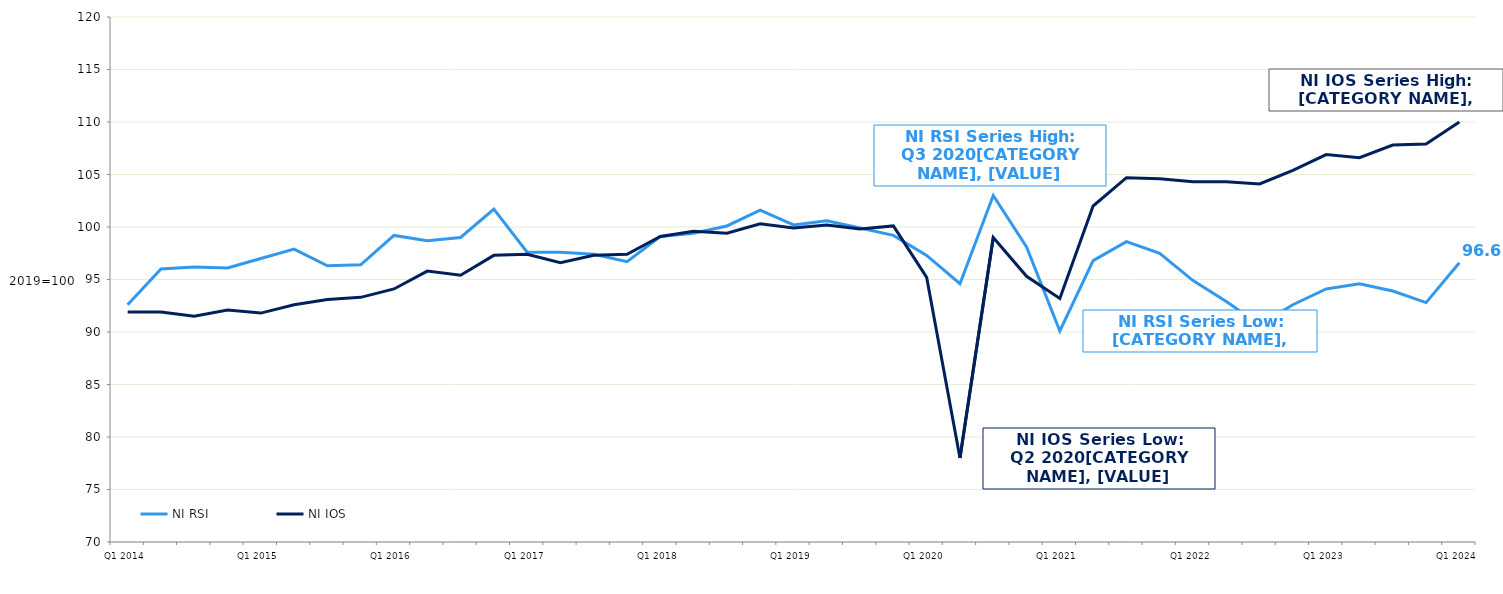
| Category | NI RSI | NI IOS |
|---|---|---|
| Q1 2014 | 92.6 | 91.9 |
|  | 96 | 91.9 |
|  | 96.2 | 91.5 |
|  | 96.1 | 92.1 |
| Q1 2015 | 97 | 91.8 |
|  | 97.9 | 92.6 |
|  | 96.3 | 93.1 |
|  | 96.4 | 93.3 |
| Q1 2016 | 99.2 | 94.1 |
|  | 98.7 | 95.8 |
|  | 99 | 95.4 |
|  | 101.7 | 97.3 |
| Q1 2017 | 97.6 | 97.4 |
|  | 97.6 | 96.6 |
|  | 97.4 | 97.3 |
|  | 96.7 | 97.4 |
| Q1 2018 | 99.1 | 99.1 |
|  | 99.4 | 99.6 |
|  | 100.1 | 99.4 |
|  | 101.6 | 100.3 |
| Q1 2019 | 100.2 | 99.9 |
|  | 100.6 | 100.2 |
|  | 99.9 | 99.8 |
|  | 99.2 | 100.1 |
| Q1 2020 | 97.3 | 95.2 |
|  | 94.6 | 78 |
|  | 103 | 99 |
|  | 98.1 | 95.3 |
| Q1 2021 | 90.1 | 93.2 |
|  | 96.8 | 102 |
|  | 98.6 | 104.7 |
|  | 97.5 | 104.6 |
| Q1 2022 | 94.9 | 104.3 |
|  | 92.9 | 104.3 |
|  | 90.7 | 104.1 |
|  | 92.6 | 105.4 |
| Q1 2023 | 94.1 | 106.9 |
|  | 94.6 | 106.6 |
|  | 93.9 | 107.8 |
|  | 92.8 | 107.9 |
| Q1 2024 | 96.6 | 110 |